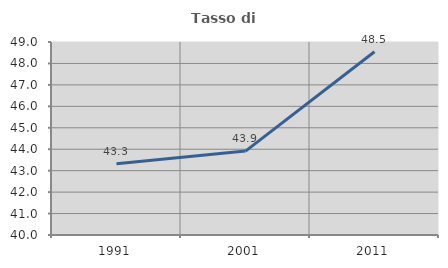
| Category | Tasso di occupazione   |
|---|---|
| 1991.0 | 43.324 |
| 2001.0 | 43.914 |
| 2011.0 | 48.543 |